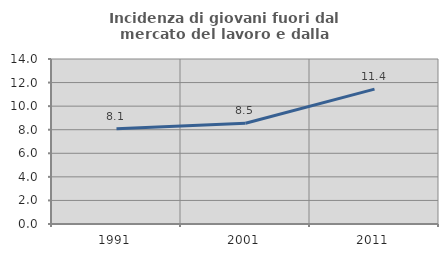
| Category | Incidenza di giovani fuori dal mercato del lavoro e dalla formazione  |
|---|---|
| 1991.0 | 8.075 |
| 2001.0 | 8.547 |
| 2011.0 | 11.443 |